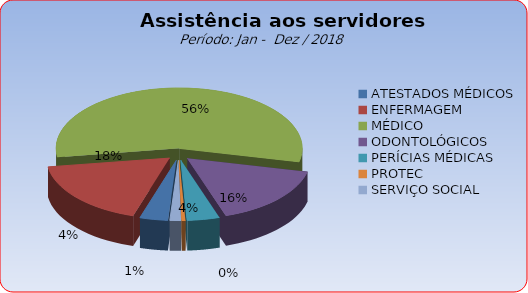
| Category | Series 0 |
|---|---|
| ATESTADOS MÉDICOS | 3.695 |
| ENFERMAGEM | 17.866 |
| MÉDICO | 55.897 |
| ODONTOLÓGICOS | 16.356 |
| PERÍCIAS MÉDICAS | 4.258 |
| PROTEC | 0.466 |
| SERVIÇO SOCIAL | 1.462 |